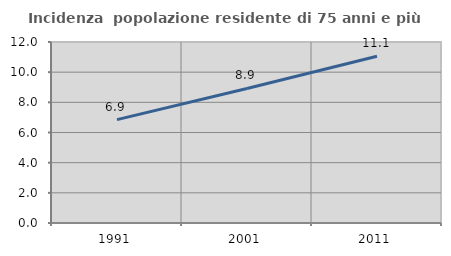
| Category | Incidenza  popolazione residente di 75 anni e più |
|---|---|
| 1991.0 | 6.853 |
| 2001.0 | 8.922 |
| 2011.0 | 11.054 |